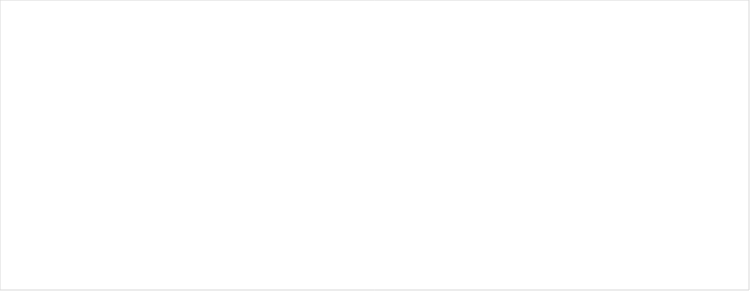
| Category | RESERVAS CONSTITUIDAS
 | CANCELACIONES RESERVAS PRESUPUESTALES
  | PAGOS
ACUMULADOS
 |
|---|---|---|---|
| A-FUNCIONAMIENTO | 2249.649 | 0 | 2135.218 |
| C-INVERSIÓN | 53197.266 | 0 | 18388.114 |